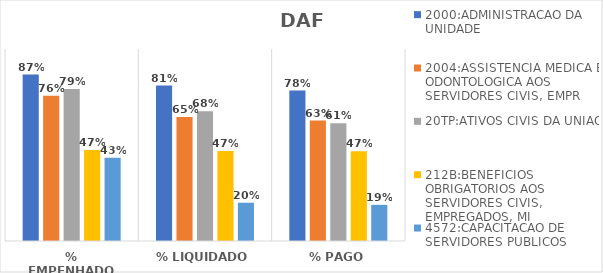
| Category | 2000:ADMINISTRACAO DA UNIDADE | 2004:ASSISTENCIA MEDICA E ODONTOLOGICA AOS SERVIDORES CIVIS, EMPR | 20TP:ATIVOS CIVIS DA UNIAO | 212B:BENEFICIOS OBRIGATORIOS AOS SERVIDORES CIVIS, EMPREGADOS, MI | 4572:CAPACITACAO DE SERVIDORES PUBLICOS FEDERAIS EM PROCESSO DE Q |
|---|---|---|---|---|---|
| % EMPENHADO | 0.867 | 0.757 | 0.791 | 0.473 | 0.434 |
| % LIQUIDADO | 0.81 | 0.646 | 0.676 | 0.468 | 0.199 |
| % PAGO | 0.784 | 0.627 | 0.614 | 0.467 | 0.188 |